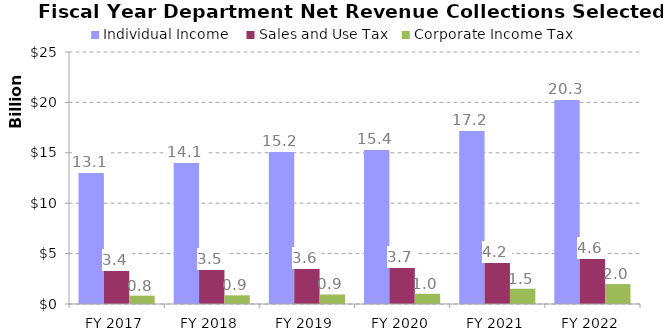
| Category | Individual Income  | Sales and Use Tax | Corporate Income Tax  |
|---|---|---|---|
| FY 2017 | 13052887000 | 3354561000 | 826960822.31 |
| FY 2018 | 14105766000 | 3458249000 | 861897138.18 |
| FY 2019 | 15226471000 | 3580355000 | 943391000 |
| FY 2020 | 15351592000 | 3706817000 | 1011650000 |
| FY 2021 | 17237352000 | 4166182000 | 1515692000 |
| FY 2022 | 20324954000 | 4558082000 | 1978697000 |